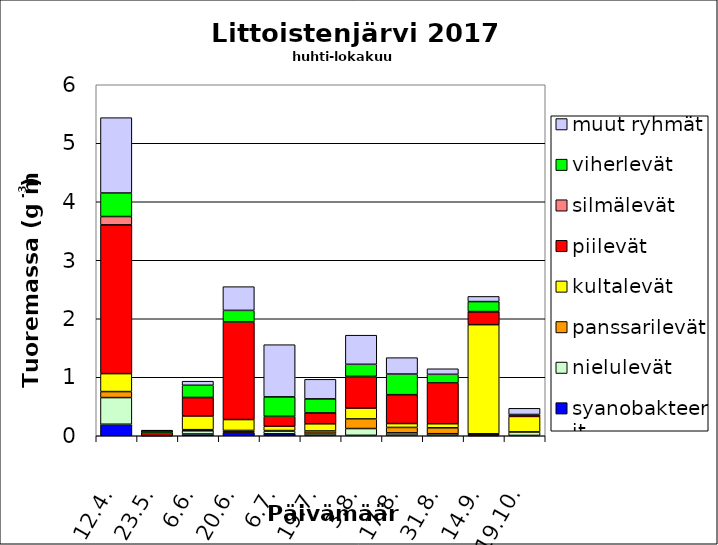
| Category | syanobakteerit | nielulevät | panssarilevät | kultalevät | piilevät | silmälevät | viherlevät | muut ryhmät |
|---|---|---|---|---|---|---|---|---|
| 12.4. | 0.197 | 0.456 | 0.103 | 0.307 | 2.543 | 0.142 | 0.402 | 1.288 |
| 23.5. | 0.003 | 0 | 0.002 | 0 | 0.053 | 0.004 | 0.024 | 0.009 |
| 6.6. | 0.031 | 0.054 | 0.019 | 0.234 | 0.317 | 0 | 0.208 | 0.07 |
| 20.6. | 0.051 | 0.016 | 0.025 | 0.186 | 1.669 | 0 | 0.197 | 0.406 |
| 6.7. | 0.033 | 0.046 | 0.01 | 0.074 | 0.171 | 0 | 0.331 | 0.892 |
| 19.7. | 0.011 | 0.033 | 0.038 | 0.122 | 0.187 | 0 | 0.239 | 0.334 |
| 3.8. | 0.007 | 0.116 | 0.164 | 0.185 | 0.537 | 0.006 | 0.205 | 0.498 |
| 17.8. | 0.01 | 0.039 | 0.093 | 0.066 | 0.494 | 0 | 0.353 | 0.28 |
| 31.8. | 0.007 | 0.028 | 0.101 | 0.07 | 0.698 | 0 | 0.147 | 0.095 |
| 14.9. | 0.003 | 0.012 | 0.018 | 1.866 | 0.221 | 0.003 | 0.171 | 0.088 |
| 19.10. | 0.005 | 0.058 | 0.003 | 0.264 | 0.023 | 0 | 0.01 | 0.106 |